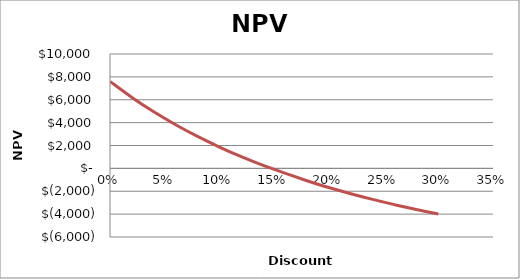
| Category | Series 1 |
|---|---|
| 0.0 | 7600 |
| 0.02 | 6203.241 |
| 0.04 | 4947.804 |
| 0.06 | 3816.131 |
| 0.08 | 2793.185 |
| 0.1 | 1866.048 |
| 0.12 | 1023.581 |
| 0.14 | 256.154 |
| 0.18 | -1085.916 |
| 0.2 | -1674.168 |
| 0.22 | -2214.895 |
| 0.24 | -2712.964 |
| 0.26 | -3172.655 |
| 0.28 | -3597.744 |
| 0.3 | -3991.565 |